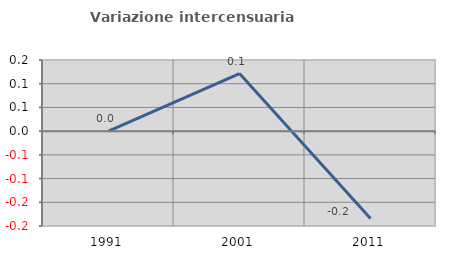
| Category | Variazione intercensuaria annua |
|---|---|
| 1991.0 | 0 |
| 2001.0 | 0.121 |
| 2011.0 | -0.184 |